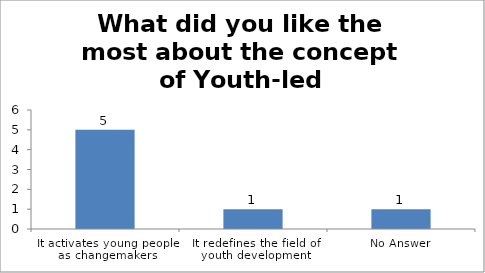
| Category | What did you like the most about the concept of Youth-led Changemaking? |
|---|---|
| It activates young people as changemakers | 5 |
| It redefines the field of youth development | 1 |
| No Answer | 1 |